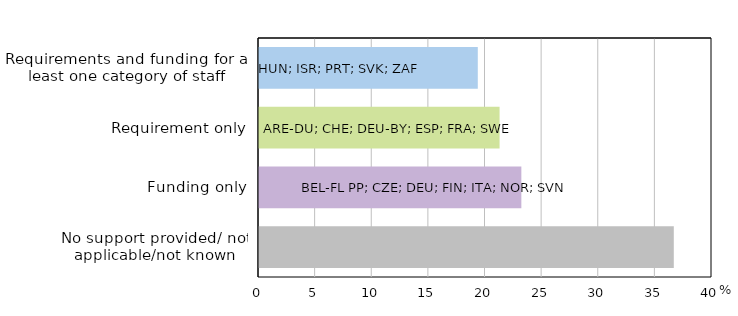
| Category | Series 0 |
|---|---|
| Requirements and funding for at least one category of staff | 19.231 |
| Requirement only | 21.154 |
| Funding only | 23.077 |
| No support provided/ not applicable/not known | 36.538 |